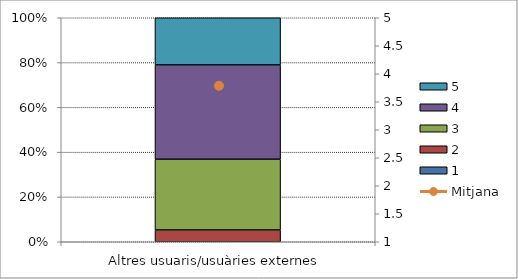
| Category | 1 | 2 | 3 | 4 | 5 |
|---|---|---|---|---|---|
| Altres usuaris/usuàries externes | 0 | 1 | 6 | 8 | 4 |